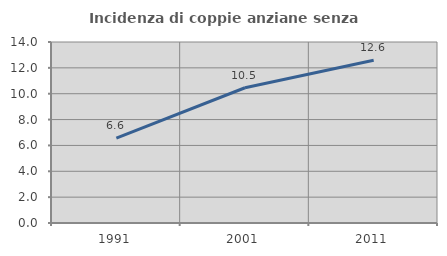
| Category | Incidenza di coppie anziane senza figli  |
|---|---|
| 1991.0 | 6.567 |
| 2001.0 | 10.462 |
| 2011.0 | 12.583 |